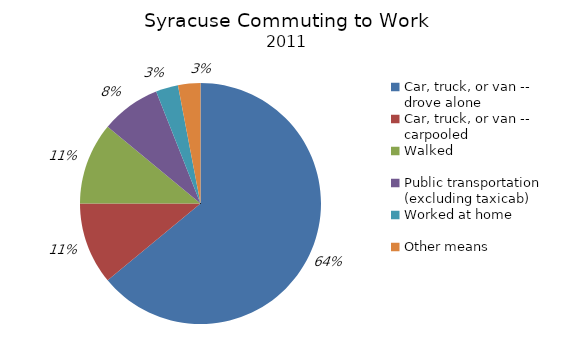
| Category | Series 0 | Series 1 |
|---|---|---|
| Car, truck, or van -- drove alone | 0.64 | 0.64 |
| Car, truck, or van -- carpooled | 0.11 | 0.11 |
| Walked | 0.11 | 0.11 |
| Public transportation (excluding taxicab) | 0.08 | 0.08 |
| Worked at home | 0.03 | 0.03 |
| Other means | 0.03 | 0.03 |